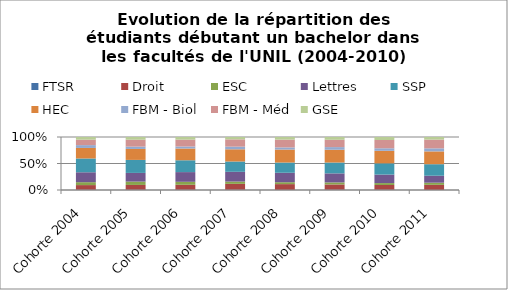
| Category | FTSR | Droit | ESC | Lettres | SSP | HEC | FBM - Biol | FBM - Méd | GSE |
|---|---|---|---|---|---|---|---|---|---|
| Cohorte 2004 | 9 | 155 | 97 | 331 | 460 | 352 | 94 | 181 | 90 |
| Cohorte 2005 | 10 | 177 | 124 | 321 | 481 | 405 | 86 | 255 | 101 |
| Cohorte 2006 | 10 | 193 | 117 | 379 | 462 | 459 | 78 | 267 | 104 |
| Cohorte 2007 | 11 | 216 | 85 | 361 | 382 | 451 | 98 | 269 | 88 |
| Cohorte 2008 | 6 | 230 | 77 | 379 | 411 | 522 | 85 | 313 | 106 |
| Cohorte 2009 | 13 | 212 | 82 | 366 | 439 | 517 | 107 | 296 | 113 |
| Cohorte 2010 | 11 | 209 | 86 | 375 | 497 | 553 | 113 | 366 | 132 |
| Cohorte 2011 | 3 | 226 | 96 | 309 | 512 | 569 | 135 | 388 | 116 |